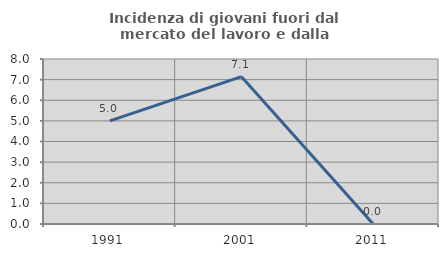
| Category | Incidenza di giovani fuori dal mercato del lavoro e dalla formazione  |
|---|---|
| 1991.0 | 5 |
| 2001.0 | 7.143 |
| 2011.0 | 0 |